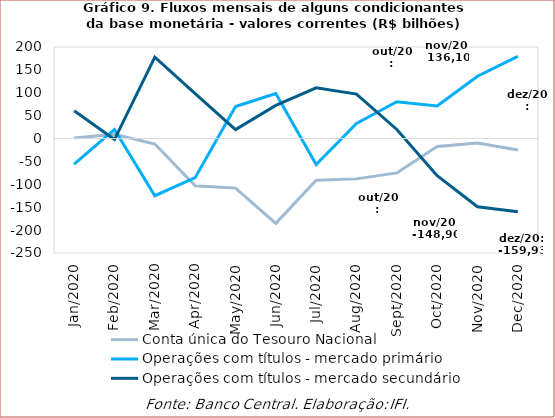
| Category | Conta única do Tesouro Nacional | Operações com títulos - mercado primário | Operações com títulos - mercado secundário |
|---|---|---|---|
| 2020-01-01 | 1.409 | -55.64 | 60.868 |
| 2020-02-01 | 9.391 | 19.912 | -2.142 |
| 2020-03-01 | -11.994 | -124.9 | 177.8 |
| 2020-04-01 | -103.172 | -85.493 | 98.326 |
| 2020-05-01 | -108.217 | 69.955 | 19.489 |
| 2020-06-01 | -185.258 | 98.199 | 72.448 |
| 2020-07-01 | -91.061 | -56.75 | 110.839 |
| 2020-08-01 | -88.075 | 32.819 | 97.139 |
| 2020-09-01 | -75.015 | 80.451 | 19.919 |
| 2020-10-01 | -17.37 | 71.371 | -81.287 |
| 2020-11-01 | -9.62 | 136.096 | -148.895 |
| 2020-12-01 | -25.213 | 179.441 | -159.931 |